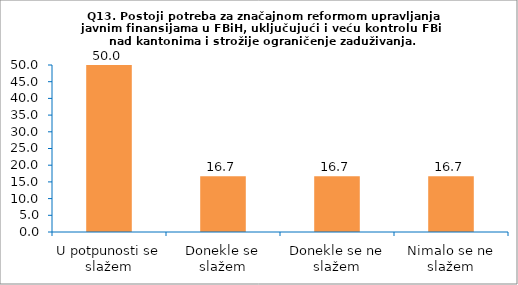
| Category | Series 0 |
|---|---|
| U potpunosti se slažem | 50 |
| Donekle se slažem | 16.667 |
| Donekle se ne slažem | 16.667 |
| Nimalo se ne slažem | 16.667 |